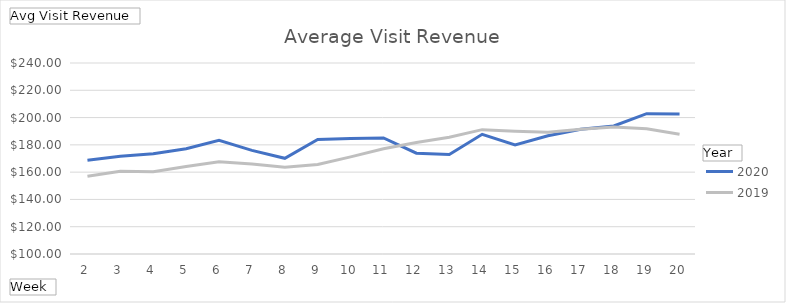
| Category | 2020 | 2019 |
|---|---|---|
| 2 | 168.714 | 156.971 |
| 3 | 171.594 | 160.655 |
| 4 | 173.409 | 160.36 |
| 5 | 177.128 | 164.196 |
| 6 | 183.344 | 167.529 |
| 7 | 175.983 | 165.896 |
| 8 | 170.136 | 163.514 |
| 9 | 183.888 | 165.578 |
| 10 | 184.65 | 171.199 |
| 11 | 185.09 | 177.083 |
| 12 | 173.92 | 181.787 |
| 13 | 172.996 | 185.605 |
| 14 | 187.711 | 191.138 |
| 15 | 179.864 | 190.033 |
| 16 | 186.638 | 189.322 |
| 17 | 191.388 | 191.444 |
| 18 | 193.822 | 193.111 |
| 19 | 202.878 | 191.837 |
| 20 | 202.622 | 187.834 |